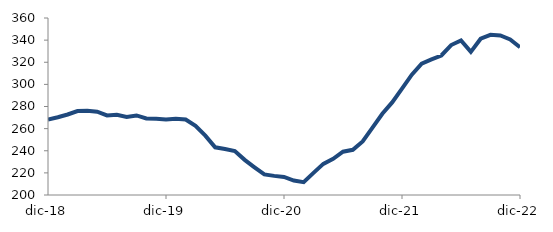
| Category | Series 0 |
|---|---|
| 2018-12-01 | 268.288 |
| 2019-01-01 | 270.264 |
| 2019-02-01 | 272.765 |
| 2019-03-01 | 275.922 |
| 2019-04-01 | 276.17 |
| 2019-05-01 | 275.323 |
| 2019-06-01 | 271.933 |
| 2019-07-01 | 272.528 |
| 2019-08-01 | 270.617 |
| 2019-09-01 | 271.909 |
| 2019-10-01 | 269.246 |
| 2019-11-01 | 268.873 |
| 2019-12-01 | 268.319 |
| 2020-01-01 | 268.914 |
| 2020-02-01 | 268.233 |
| 2020-03-01 | 262.58 |
| 2020-04-01 | 253.663 |
| 2020-05-01 | 243.088 |
| 2020-06-01 | 241.541 |
| 2020-07-01 | 239.786 |
| 2020-08-01 | 231.766 |
| 2020-09-01 | 225.047 |
| 2020-10-01 | 218.571 |
| 2020-11-01 | 217.286 |
| 2020-12-01 | 216.368 |
| 2021-01-01 | 213.087 |
| 2021-02-01 | 211.643 |
| 2021-03-01 | 220.04 |
| 2021-04-01 | 228.12 |
| 2021-05-01 | 232.717 |
| 2021-06-01 | 239.097 |
| 2021-07-01 | 240.846 |
| 2021-08-01 | 248.449 |
| 2021-09-01 | 260.934 |
| 2021-10-01 | 273.441 |
| 2021-11-01 | 283.683 |
| 2021-12-01 | 296.134 |
| 2022-01-01 | 308.804 |
| 2022-02-01 | 318.726 |
| 2022-03-01 | 322.592 |
| 2022-04-01 | 326.114 |
| 2022-05-01 | 335.557 |
| 2022-06-01 | 339.684 |
| 2022-07-01 | 329.357 |
| 2022-08-01 | 341.293 |
| 2022-09-01 | 344.793 |
| 2022-10-01 | 344.185 |
| 2022-11-01 | 340.608 |
| 2022-12-01 | 333.559 |